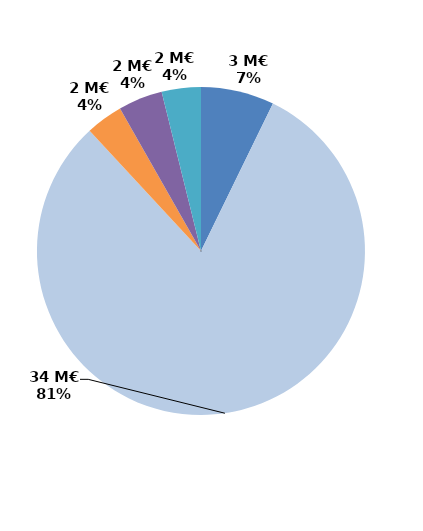
| Category | Series 0 |
|---|---|
| Contrats aidés marchand (hors IAE) | 3.066 |
| Contrats aidés non marchand (hors IAE) | 34.306 |
| Insertion par l'activité économique | 1.554 |
| Mesures en faveur des handicapés | 1.85 |
| Autres emplois aidés | 1.637 |